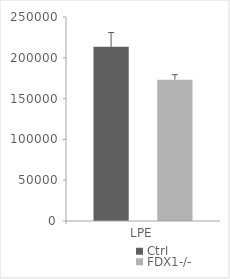
| Category | Ctrl | FDX1-/- |
|---|---|---|
| LPE | 213401.575 | 173152.283 |